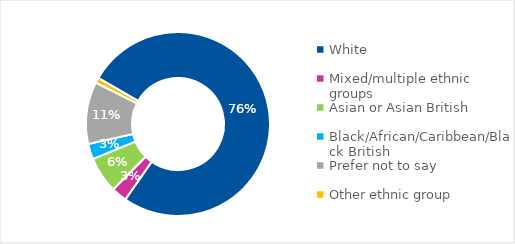
| Category | Series 0 |
|---|---|
| White | 0.764 |
| Mixed/multiple ethnic groups | 0.027 |
| Asian or Asian British | 0.064 |
| Black/African/Caribbean/Black British | 0.027 |
| Prefer not to say | 0.109 |
| Other ethnic group | 0.009 |